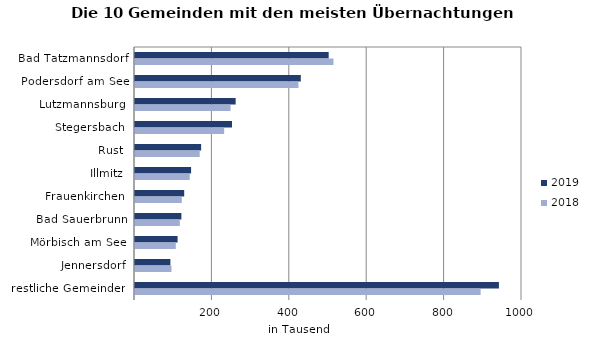
| Category | 2019 | 2018 |
|---|---|---|
| Bad Tatzmannsdorf | 500456 | 512880 |
| Podersdorf am See | 428417 | 422304 |
| Lutzmannsburg | 260076 | 246995 |
| Stegersbach | 250675 | 230344 |
| Rust | 170883 | 167221 |
| Illmitz | 144929 | 141400 |
| Frauenkirchen | 127115 | 120863 |
| Bad Sauerbrunn | 119861 | 115785 |
| Mörbisch am See | 110023 | 105398 |
| Jennersdorf | 91435 | 94264 |
| restliche Gemeinden | 940362 | 893110 |